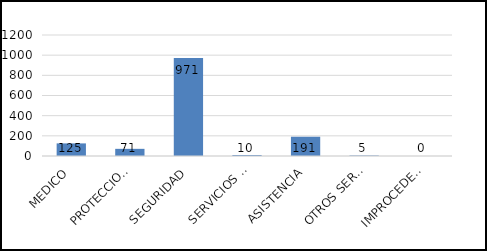
| Category | TOTAL |
|---|---|
| MEDICO | 125 |
| PROTECCION CIVIL | 71 |
| SEGURIDAD | 971 |
| SERVICIOS PUBLICOS | 10 |
| ASISTENCIA | 191 |
| OTROS SERVICIOS | 5 |
| IMPROCEDENTES | 0 |